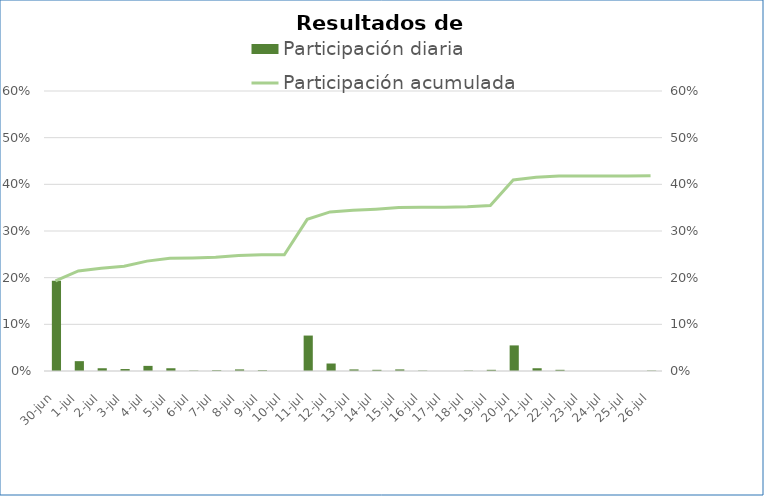
| Category | Participación diaria |
|---|---|
| 2022-06-30 | 0.193 |
| 2022-07-01 | 0.021 |
| 2022-07-02 | 0.006 |
| 2022-07-03 | 0.004 |
| 2022-07-04 | 0.011 |
| 2022-07-05 | 0.006 |
| 2022-07-06 | 0.001 |
| 2022-07-07 | 0.002 |
| 2022-07-08 | 0.003 |
| 2022-07-09 | 0.002 |
| 2022-07-10 | 0 |
| 2022-07-11 | 0.076 |
| 2022-07-12 | 0.016 |
| 2022-07-13 | 0.003 |
| 2022-07-14 | 0.003 |
| 2022-07-15 | 0.003 |
| 2022-07-16 | 0.001 |
| 2022-07-17 | 0 |
| 2022-07-18 | 0.001 |
| 2022-07-19 | 0.003 |
| 2022-07-20 | 0.055 |
| 2022-07-21 | 0.006 |
| 2022-07-22 | 0.003 |
| 2022-07-23 | 0 |
| 2022-07-24 | 0 |
| 2022-07-25 | 0 |
| 2022-07-26 | 0.001 |